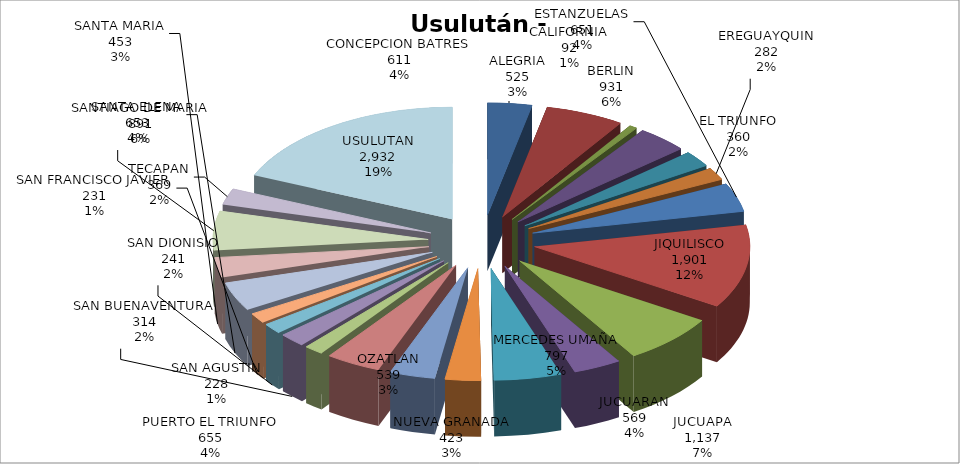
| Category | Series 0 |
|---|---|
| ALEGRIA | 525 |
| BERLIN | 931 |
| CALIFORNIA | 92 |
| CONCEPCION BATRES | 611 |
| EL TRIUNFO | 360 |
| EREGUAYQUIN | 282 |
| ESTANZUELAS | 651 |
| JIQUILISCO | 1901 |
| JUCUAPA | 1137 |
| JUCUARAN | 569 |
| MERCEDES UMAÑA | 797 |
| NUEVA GRANADA | 423 |
| OZATLAN | 539 |
| PUERTO EL TRIUNFO | 655 |
| SAN AGUSTIN | 228 |
| SAN BUENAVENTURA | 314 |
| SAN DIONISIO | 241 |
| SAN FRANCISCO JAVIER | 231 |
| SANTA ELENA | 653 |
| SANTA MARIA | 453 |
| SANTIAGO DE MARIA | 891 |
| TECAPAN | 369 |
| USULUTAN | 2932 |